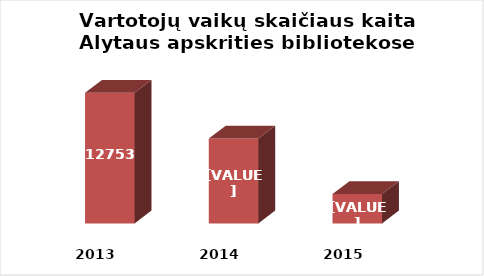
| Category | Series 0 |
|---|---|
| 2013.0 | 12753 |
| 2014.0 | 12419 |
| 2015.0 | 12015 |